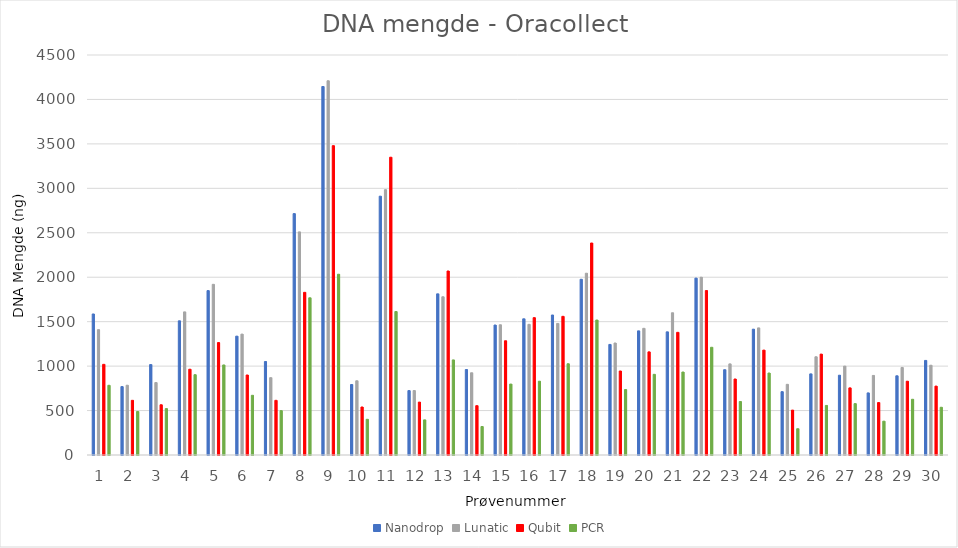
| Category | Nanodrop | Lunatic | Qubit | PCR |
|---|---|---|---|---|
| 1.0 | 1586.5 | 1410 | 1020 | 784 |
| 2.0 | 769.5 | 785 | 615 | 489.5 |
| 3.0 | 1017.5 | 815 | 565 | 522 |
| 4.0 | 1509.5 | 1610 | 965 | 903.5 |
| 5.0 | 1849.5 | 1920 | 1265 | 1013 |
| 6.0 | 1337 | 1360 | 900 | 671.5 |
| 7.0 | 1051.5 | 870 | 615 | 499 |
| 8.0 | 2715.5 | 2510 | 1830 | 1768.5 |
| 9.0 | 4145.5 | 4210 | 3480 | 2033.5 |
| 10.0 | 793 | 835 | 540 | 401.5 |
| 11.0 | 2911.5 | 2985 | 3350 | 1614 |
| 12.0 | 724.5 | 725 | 595 | 395 |
| 13.0 | 1813 | 1780 | 2070 | 1069.5 |
| 14.0 | 961.5 | 925 | 555 | 320.5 |
| 15.0 | 1462 | 1465 | 1285 | 798 |
| 16.0 | 1532 | 1470 | 1545 | 830 |
| 17.0 | 1575 | 1480 | 1560 | 1026.5 |
| 18.0 | 1977 | 2045 | 2385 | 1518.5 |
| 19.0 | 1244 | 1260 | 945 | 736 |
| 20.0 | 1396.5 | 1425 | 1160 | 907.5 |
| 21.0 | 1385.5 | 1600 | 1380 | 933.5 |
| 22.0 | 1990 | 2000 | 1850 | 1212 |
| 23.0 | 959.5 | 1025 | 855 | 601.5 |
| 24.0 | 1415.5 | 1430 | 1180 | 922 |
| 25.0 | 712.5 | 795 | 505 | 295.5 |
| 26.0 | 912.5 | 1105 | 1135 | 557.5 |
| 27.0 | 897.5 | 1000 | 755 | 578 |
| 28.0 | 698.5 | 895 | 590 | 380.5 |
| 29.0 | 891 | 985 | 830 | 627 |
| 30.0 | 1064 | 1010 | 775 | 537 |